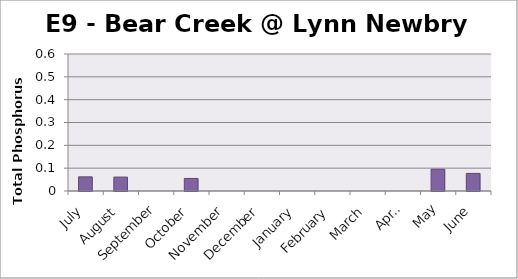
| Category | Phosphorus (mg/L) |
|---|---|
| July | 0.062 |
| August | 0.061 |
| September | 0 |
| October | 0.055 |
| November | 0 |
| December | 0 |
| January | 0 |
| February | 0 |
| March | 0 |
| April | 0 |
| May | 0.095 |
| June | 0.077 |